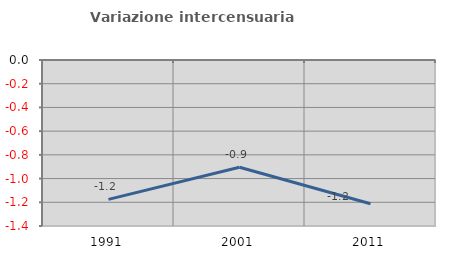
| Category | Variazione intercensuaria annua |
|---|---|
| 1991.0 | -1.175 |
| 2001.0 | -0.904 |
| 2011.0 | -1.213 |